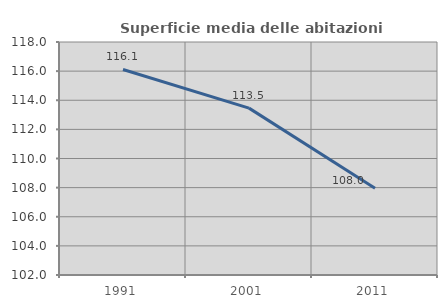
| Category | Superficie media delle abitazioni occupate |
|---|---|
| 1991.0 | 116.115 |
| 2001.0 | 113.459 |
| 2011.0 | 107.961 |